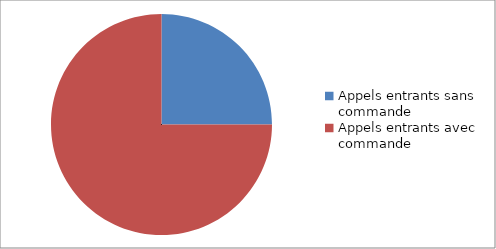
| Category | Series 0 |
|---|---|
| Appels entrants sans commande | 0.25 |
| Appels entrants avec commande | 0.75 |